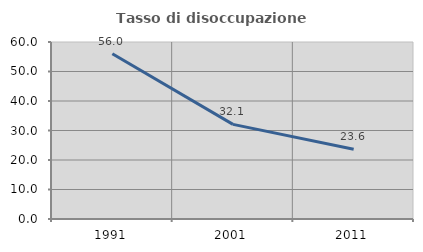
| Category | Tasso di disoccupazione giovanile  |
|---|---|
| 1991.0 | 56.034 |
| 2001.0 | 32.075 |
| 2011.0 | 23.636 |